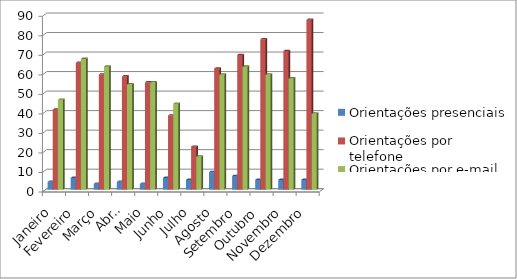
| Category | Orientações presenciais | Orientações por telefone | Orientações por e-mail |
|---|---|---|---|
| Janeiro | 4 | 41 | 46 |
| Fevereiro | 6 | 65 | 67 |
| Março | 3 | 59 | 63 |
| Abril | 4 | 58 | 54 |
| Maio | 3 | 55 | 55 |
| Junho | 6 | 38 | 44 |
| Julho | 5 | 22 | 17 |
| Agosto | 9 | 62 | 59 |
| Setembro | 7 | 69 | 63 |
| Outubro | 5 | 77 | 59 |
| Novembro | 5 | 71 | 57 |
| Dezembro | 5 | 87 | 39 |